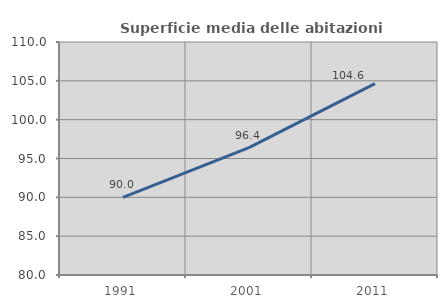
| Category | Superficie media delle abitazioni occupate |
|---|---|
| 1991.0 | 89.986 |
| 2001.0 | 96.394 |
| 2011.0 | 104.636 |